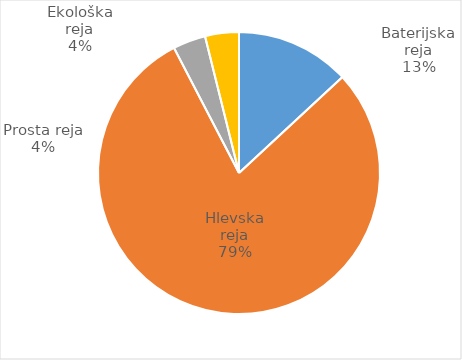
| Category | Število kosov jajc |
|---|---|
| Baterijska reja | 316475 |
| Hlevska reja | 1915676 |
| Prosta reja | 90661 |
| Ekološka reja | 93660 |